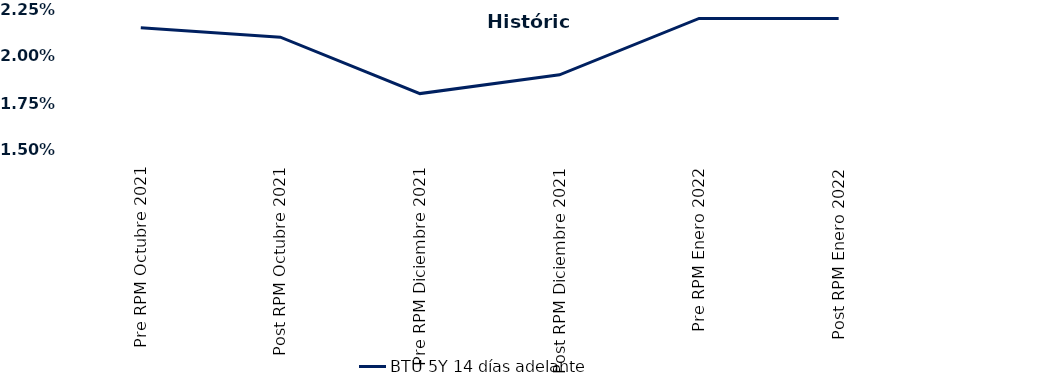
| Category | BTU 5Y 14 días adelante |
|---|---|
| Pre RPM Octubre 2021 | 0.022 |
| Post RPM Octubre 2021 | 0.021 |
| Pre RPM Diciembre 2021 | 0.018 |
| Post RPM Diciembre 2021 | 0.019 |
| Pre RPM Enero 2022 | 0.022 |
| Post RPM Enero 2022 | 0.022 |